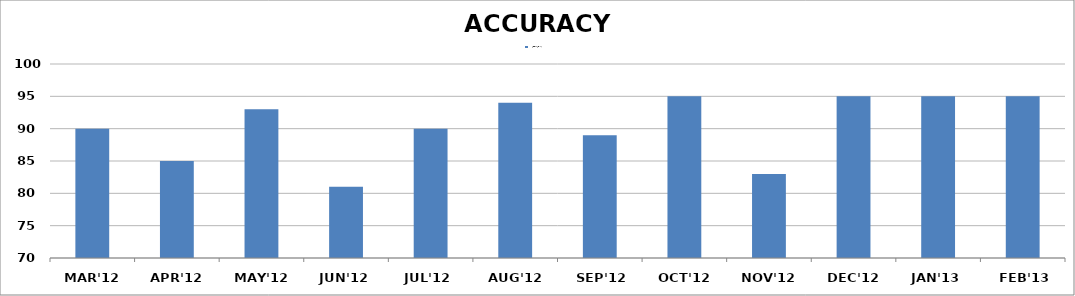
| Category | ACCURACY IN % |
|---|---|
| MAR'12 | 90 |
| APR'12 | 85 |
| MAY'12 | 93 |
| JUN'12 | 81 |
| JUL'12 | 90 |
| AUG'12 | 94 |
| SEP'12 | 89 |
| OCT'12 | 95 |
| NOV'12 | 83 |
| DEC'12 | 95 |
| JAN'13 | 95 |
| FEB'13 | 95 |